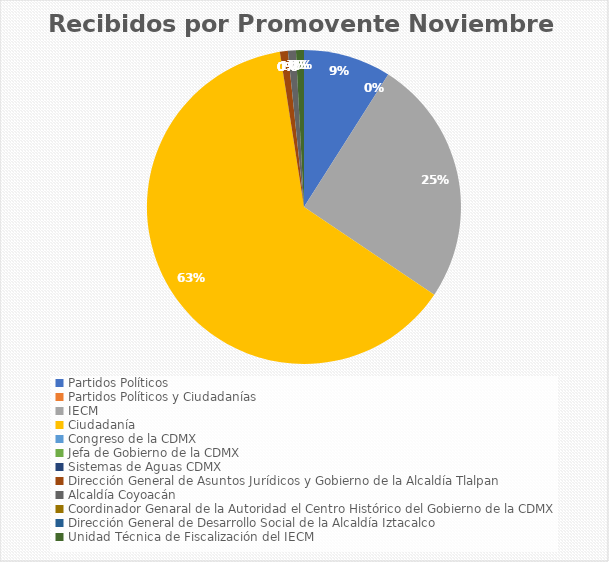
| Category | Recibidos por Promovente Noviembre |
|---|---|
| Partidos Políticos | 11 |
| Partidos Políticos y Ciudadanías | 0 |
| IECM | 31 |
| Ciudadanía  | 77 |
| Congreso de la CDMX | 0 |
| Jefa de Gobierno de la CDMX | 0 |
| Sistemas de Aguas CDMX | 0 |
| Dirección General de Asuntos Jurídicos y Gobierno de la Alcaldía Tlalpan | 1 |
| Alcaldía Coyoacán | 1 |
| Coordinador Genaral de la Autoridad el Centro Histórico del Gobierno de la CDMX | 0 |
| Dirección General de Desarrollo Social de la Alcaldía Iztacalco | 0 |
| Unidad Técnica de Fiscalización del IECM | 1 |